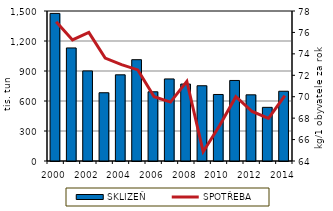
| Category | SKLIZEŇ |
|---|---|
| 2000.0 | 1475992 |
| 2001.0 | 1130477 |
| 2002.0 | 900843 |
| 2003.0 | 682511 |
| 2004.0 | 861798 |
| 2005.0 | 1013000 |
| 2006.0 | 692174 |
| 2007.0 | 820515 |
| 2008.0 | 769561 |
| 2009.0 | 752539 |
| 2010.0 | 665176 |
| 2011.0 | 805331 |
| 2012.0 | 661795.13 |
| 2013.0 | 536450 |
| 2014.0 | 697539.49 |